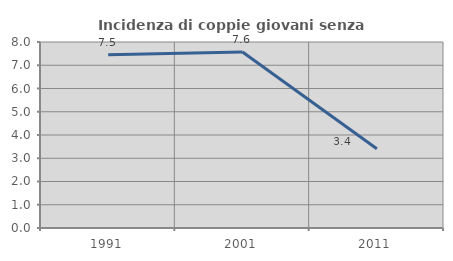
| Category | Incidenza di coppie giovani senza figli |
|---|---|
| 1991.0 | 7.453 |
| 2001.0 | 7.567 |
| 2011.0 | 3.412 |